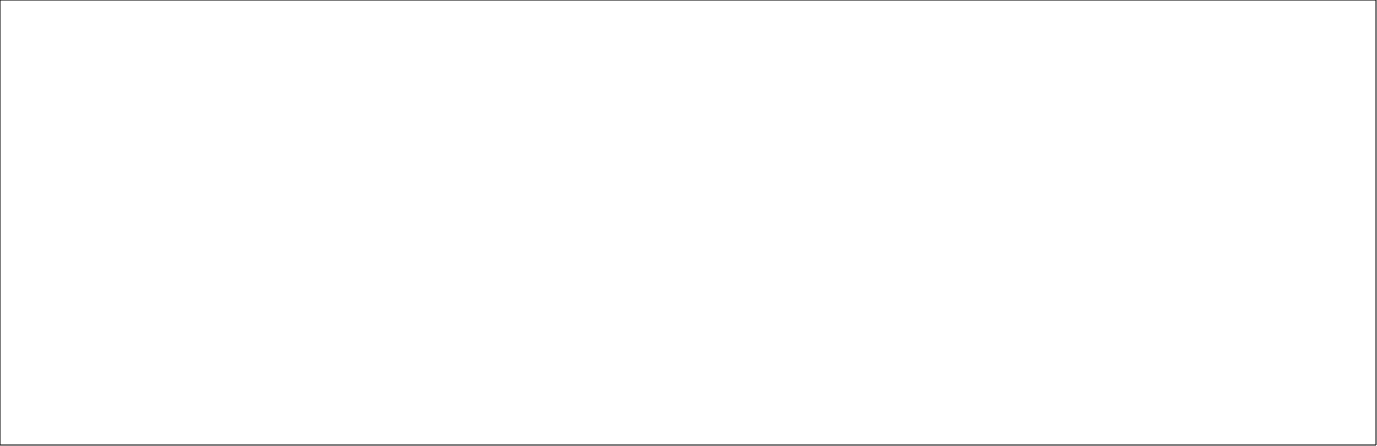
| Category | Sum of Mean |
|---|---|
| Adequate Experience | 79.99 |
| Clinical Supervision | 92.62 |
| Clinical Supervision out of hours | 90.43 |
| Curriculum Coverage | 78.57 |
| Educational Governance | 75.31 |
| Educational Supervision | 87.04 |
| Feedback | 76.99 |
| Handover | 68.02 |
| Induction | 79.31 |
| Local Teaching | 70.15 |
| Overall Satisfaction | 80.78 |
| Regional Teaching | 68.8 |
| Reporting systems | 76.1 |
| Rota Design | 62.69 |
| Study Leave | 67.69 |
| Supportive environment | 72.89 |
| Teamwork | 77.8 |
| Work Load | 47.98 |